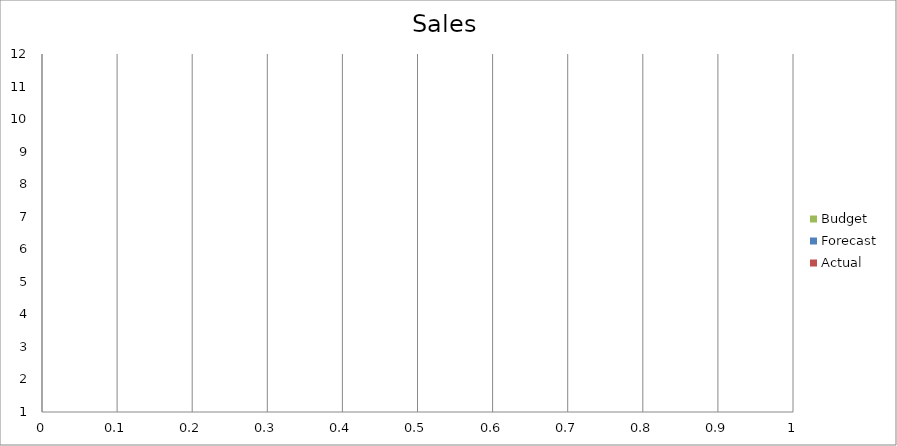
| Category | Budget | Forecast | Actual |
|---|---|---|---|
| 0 | 950 | 890 | 2140 |
| 1 | 2740 | 1050 | 1630 |
| 2 | 1650 | 1300 | 2550 |
| 3 | 1500 | 1370 | 2600 |
| 4 | 1470 | 1840 | 1550 |
| 5 | 2650 | 1920 | 2690 |
| 6 | 2110 | 660 | 2410 |
| 7 | 2620 | 1830 | 2030 |
| 8 | 2580 | 1050 | 590 |
| 9 | 1900 | 3430 | 1530 |
| 10 | 2500 | 1860 | 630 |
| 11 | 3350 | 1490 | 2370 |